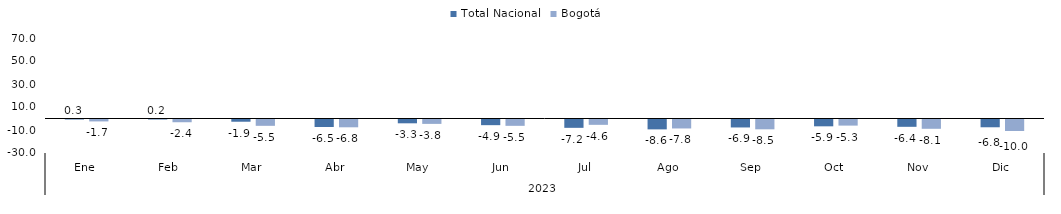
| Category | Total Nacional | Bogotá |
|---|---|---|
| 0 | 0.259 | -1.667 |
| 1 | 0.21 | -2.385 |
| 2 | -1.94 | -5.499 |
| 3 | -6.51 | -6.782 |
| 4 | -3.312 | -3.813 |
| 5 | -4.933 | -5.504 |
| 6 | -7.248 | -4.641 |
| 7 | -8.586 | -7.799 |
| 8 | -6.918 | -8.536 |
| 9 | -5.931 | -5.311 |
| 10 | -6.366 | -8.078 |
| 11 | -6.766 | -10.017 |